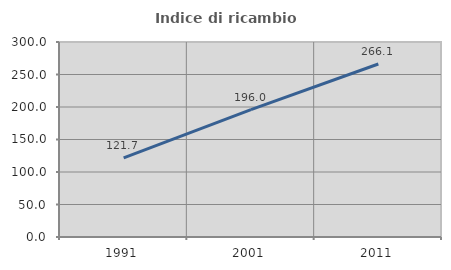
| Category | Indice di ricambio occupazionale  |
|---|---|
| 1991.0 | 121.692 |
| 2001.0 | 196.04 |
| 2011.0 | 266.121 |